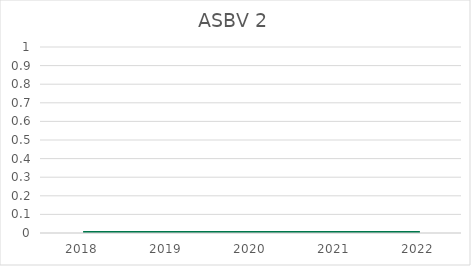
| Category | ASBV 2 |
|---|---|
| 2018.0 | 0 |
| 2019.0 | 0 |
| 2020.0 | 0 |
| 2021.0 | 0 |
| 2022.0 | 0 |